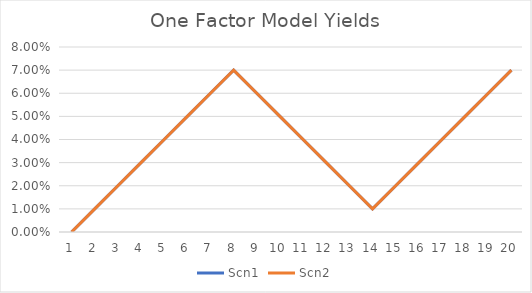
| Category | Scn1 | Scn2 |
|---|---|---|
| 0 | 0 | 0 |
| 1 | 0.01 | 0.01 |
| 2 | 0.02 | 0.02 |
| 3 | 0.03 | 0.03 |
| 4 | 0.04 | 0.04 |
| 5 | 0.05 | 0.05 |
| 6 | 0.06 | 0.06 |
| 7 | 0.07 | 0.07 |
| 8 | 0.06 | 0.06 |
| 9 | 0.05 | 0.05 |
| 10 | 0.04 | 0.04 |
| 11 | 0.03 | 0.03 |
| 12 | 0.02 | 0.02 |
| 13 | 0.01 | 0.01 |
| 14 | 0.02 | 0.02 |
| 15 | 0.03 | 0.03 |
| 16 | 0.04 | 0.04 |
| 17 | 0.05 | 0.05 |
| 18 | 0.06 | 0.06 |
| 19 | 0.07 | 0.07 |